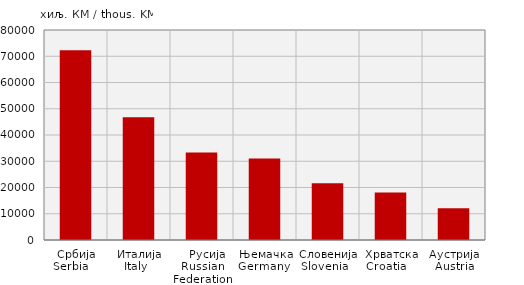
| Category | Увоз
Import |
|---|---|
| Србија
Serbia    | 72317 |
| Италија
Italy   | 46766 |
|   Русија
Russian Federation | 33311 |
| Њемачка
Germany  | 31067 |
| Словенија
Slovenia   | 21624 |
| Хрватска
Croatia    | 18101 |
| Аустрија
Austria | 12111 |